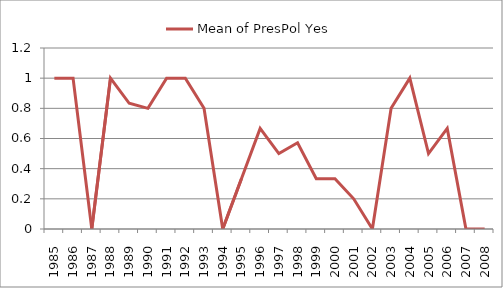
| Category | Mean of PresPol Yes |
|---|---|
| 1985.0 | 1 |
| 1986.0 | 1 |
| 1987.0 | 0 |
| 1988.0 | 1 |
| 1989.0 | 0.833 |
| 1990.0 | 0.8 |
| 1991.0 | 1 |
| 1992.0 | 1 |
| 1993.0 | 0.8 |
| 1994.0 | 0 |
| 1995.0 | 0.333 |
| 1996.0 | 0.667 |
| 1997.0 | 0.5 |
| 1998.0 | 0.571 |
| 1999.0 | 0.333 |
| 2000.0 | 0.333 |
| 2001.0 | 0.2 |
| 2002.0 | 0 |
| 2003.0 | 0.8 |
| 2004.0 | 1 |
| 2005.0 | 0.5 |
| 2006.0 | 0.667 |
| 2007.0 | 0 |
| 2008.0 | 0 |